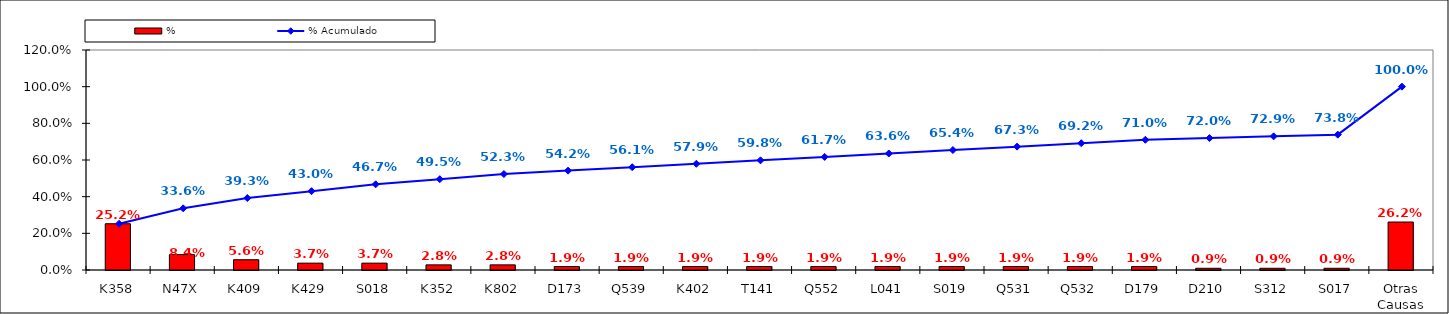
| Category | % |
|---|---|
| K358 | 0.252 |
| N47X | 0.084 |
| K409 | 0.056 |
| K429 | 0.037 |
| S018 | 0.037 |
| K352 | 0.028 |
| K802 | 0.028 |
| D173 | 0.019 |
| Q539 | 0.019 |
| K402 | 0.019 |
| T141 | 0.019 |
| Q552 | 0.019 |
| L041 | 0.019 |
| S019 | 0.019 |
| Q531 | 0.019 |
| Q532 | 0.019 |
| D179 | 0.019 |
| D210 | 0.009 |
| S312 | 0.009 |
| S017 | 0.009 |
| Otras Causas | 0.262 |